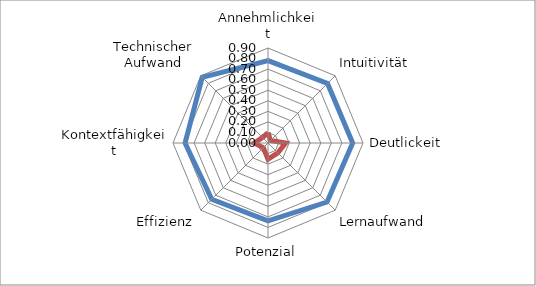
| Category | Series 0 | Series 1 |
|---|---|---|
| Annehmlichkeit | 0.78 | 0.098 |
| Intuitivität | 0.798 | 0.033 |
| Deutlickeit | 0.802 | 0.167 |
| Lernaufwand | 0.791 | 0.132 |
| Potenzial | 0.738 | 0.154 |
| Effizienz | 0.753 | 0.063 |
| Kontextfähigkeit | 0.786 | 0.131 |
| Technischer Aufwand | 0.881 | 0.073 |